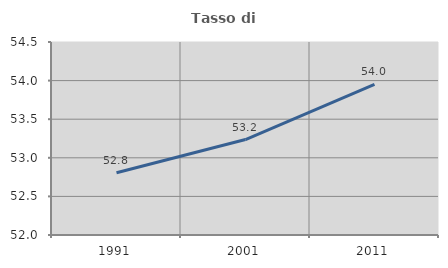
| Category | Tasso di occupazione   |
|---|---|
| 1991.0 | 52.807 |
| 2001.0 | 53.237 |
| 2011.0 | 53.952 |